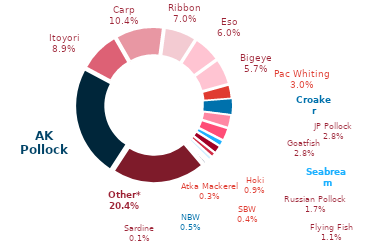
| Category | 2023 |
|---|---|
| AK Pollock | 95752 |
| Itoyori | 35876.995 |
| Carp | 41896.905 |
| Ribbon | 28227.052 |
| Eso | 24165.261 |
| Bigeye | 22938.761 |
| Pac Whiting | 12233.329 |
| Croaker | 13097.684 |
| JP Pollock | 11435.661 |
| Goatfish | 11147.461 |
| Seabream | 5280.737 |
| Russian Pollock | 6971.978 |
| Flying Fish | 4253.414 |
| Hoki | 3555.6 |
| SBW | 1600.4 |
| Atka Mackerel | 1172.378 |
| NBW | 2110.841 |
| Sardine | 264 |
| Other* | 82335.438 |